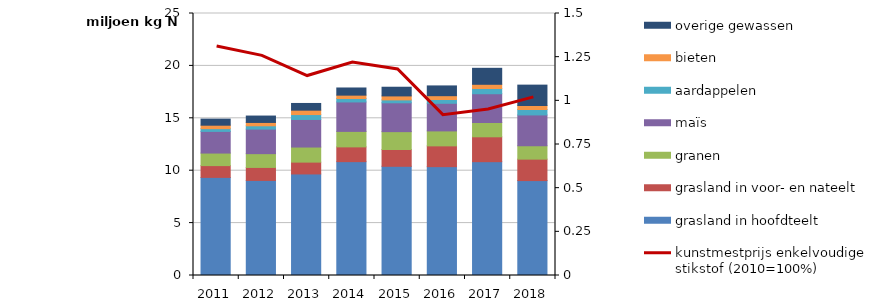
| Category | grasland in hoofdteelt | grasland in voor- en nateelt | granen | maïs | aardappelen | bieten | overige gewassen |
|---|---|---|---|---|---|---|---|
| 2011.0 | 9361705.452 | 1124683.288 | 1196715.032 | 2067864.555 | 262283.162 | 328401.691 | 579280.033 |
| 2012.0 | 9071821.333 | 1240256.845 | 1314378.44 | 2342545.408 | 315399.107 | 319762.824 | 610550.017 |
| 2013.0 | 9689952.142 | 1127388.707 | 1439484.945 | 2632108.635 | 469228.518 | 418644.124 | 638777.562 |
| 2014.0 | 10864059.053 | 1409435.79 | 1476658.782 | 2809576.979 | 331193.921 | 318852.628 | 683443.836 |
| 2015.0 | 10419049.729 | 1604266.435 | 1704352.382 | 2752249.898 | 276635.477 | 379387.269 | 828219.732 |
| 2016.0 | 10385958.254 | 1983443.306 | 1428181.723 | 2634260.282 | 361205.197 | 364798.032 | 931647.236 |
| 2017.0 | 10860867.063 | 2373424.495 | 1361957.175 | 2747206.058 | 498956.217 | 402786.445 | 1524163.506 |
| 2018.0 | 9057649.865 | 2045342.344 | 1272608.318 | 2945334.263 | 520443.657 | 378673.453 | 1945546.89 |